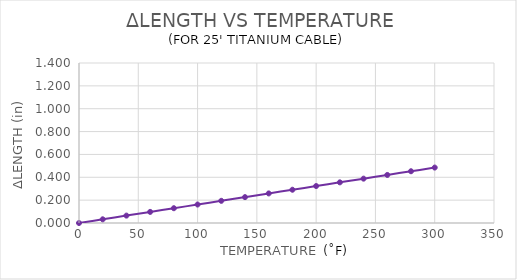
| Category | Series 0 |
|---|---|
| 0.0 | 0 |
| 20.0 | 0.032 |
| 40.0 | 0.065 |
| 60.0 | 0.097 |
| 80.0 | 0.129 |
| 100.0 | 0.162 |
| 120.0 | 0.194 |
| 140.0 | 0.226 |
| 160.0 | 0.259 |
| 180.0 | 0.291 |
| 200.0 | 0.323 |
| 220.0 | 0.356 |
| 240.0 | 0.388 |
| 260.0 | 0.42 |
| 280.0 | 0.453 |
| 300.0 | 0.485 |